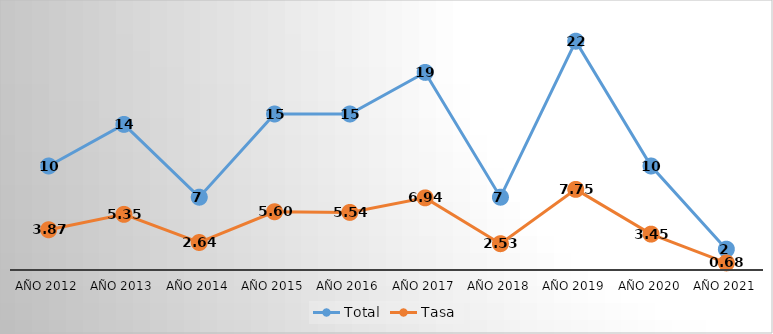
| Category | Total | Tasa |
|---|---|---|
| Año 2012 | 10 | 3.868 |
| Año 2013 | 14 | 5.35 |
| Año 2014 | 7 | 2.644 |
| Año 2015 | 15 | 5.6 |
| Año 2016 | 15 | 5.537 |
| Año 2017 | 19 | 6.936 |
| Año 2018 | 7 | 2.529 |
| Año 2019 | 22 | 7.752 |
| Año 2020 | 10 | 3.448 |
| Año 2021 | 2 | 0.679 |